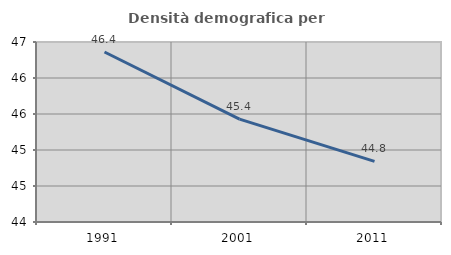
| Category | Densità demografica |
|---|---|
| 1991.0 | 46.361 |
| 2001.0 | 45.428 |
| 2011.0 | 44.842 |